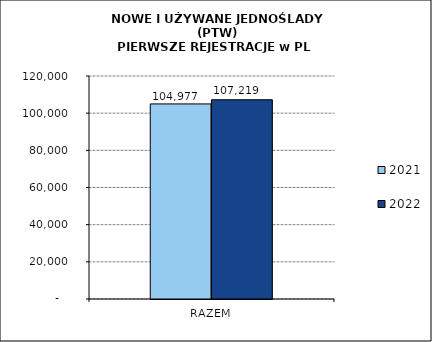
| Category | 2021 | 2022 |
|---|---|---|
| RAZEM | 104977 | 107219 |